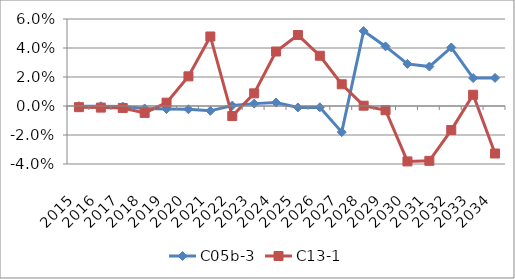
| Category | C05b-3 | C13-1 |
|---|---|---|
| 2015.0 | 0 | -0.001 |
| 2016.0 | 0 | -0.001 |
| 2017.0 | 0 | -0.001 |
| 2018.0 | -0.002 | -0.005 |
| 2019.0 | -0.002 | 0.002 |
| 2020.0 | -0.002 | 0.02 |
| 2021.0 | -0.003 | 0.048 |
| 2022.0 | 0 | -0.007 |
| 2023.0 | 0.002 | 0.009 |
| 2024.0 | 0.002 | 0.038 |
| 2025.0 | -0.001 | 0.049 |
| 2026.0 | -0.001 | 0.035 |
| 2027.0 | -0.018 | 0.015 |
| 2028.0 | 0.052 | 0 |
| 2029.0 | 0.041 | -0.003 |
| 2030.0 | 0.029 | -0.038 |
| 2031.0 | 0.027 | -0.038 |
| 2032.0 | 0.04 | -0.017 |
| 2033.0 | 0.019 | 0.008 |
| 2034.0 | 0.019 | -0.033 |